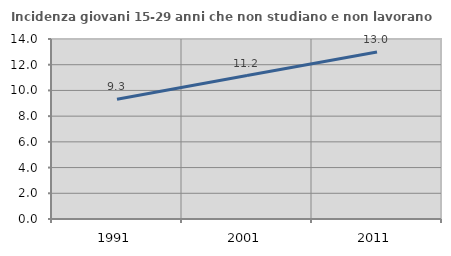
| Category | Incidenza giovani 15-29 anni che non studiano e non lavorano  |
|---|---|
| 1991.0 | 9.31 |
| 2001.0 | 11.155 |
| 2011.0 | 12.994 |